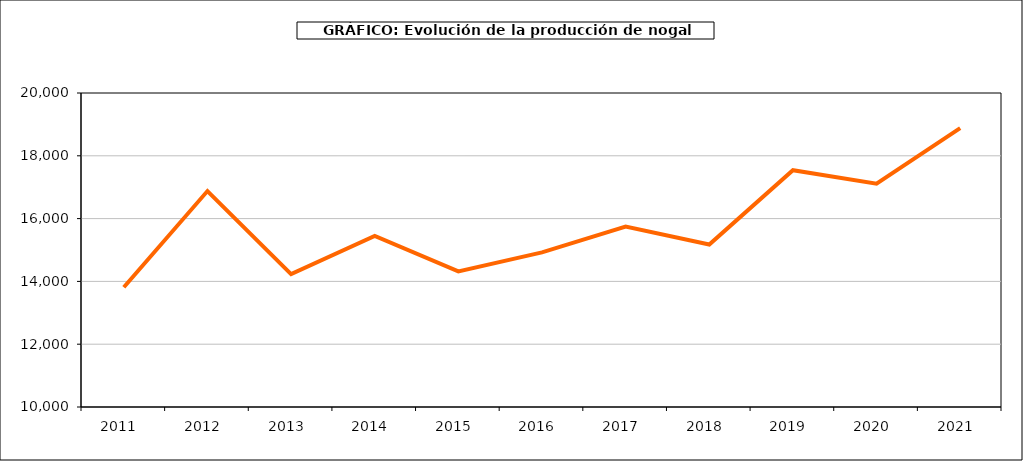
| Category | producción nogal |
|---|---|
| 2011.0 | 13815 |
| 2012.0 | 16877 |
| 2013.0 | 14230 |
| 2014.0 | 15450 |
| 2015.0 | 14319 |
| 2016.0 | 14923 |
| 2017.0 | 15744 |
| 2018.0 | 15176 |
| 2019.0 | 17542 |
| 2020.0 | 17114 |
| 2021.0 | 18883 |